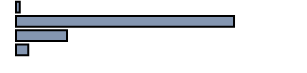
| Category | Series 0 |
|---|---|
| 0 | 1.3 |
| 1 | 76.5 |
| 2 | 17.9 |
| 3 | 4.3 |